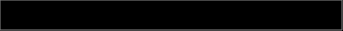
| Category | Series 0 |
|---|---|
| 0 | 0.065 |
| 1 | 0.125 |
| 2 | 0.377 |
| 3 | 0.18 |
| 4 | 0.253 |